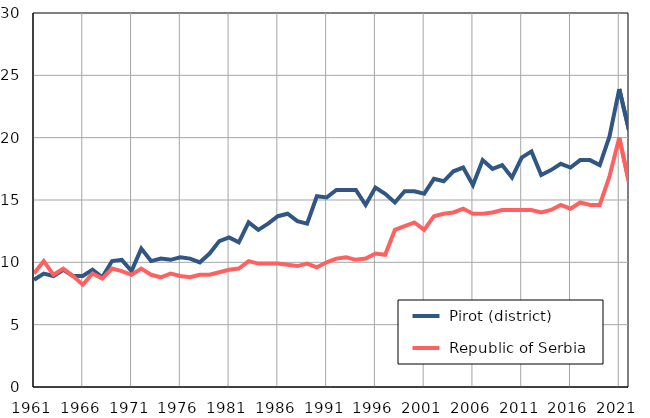
| Category |  Pirot (district) |  Republic of Serbia |
|---|---|---|
| 1961.0 | 8.6 | 9.1 |
| 1962.0 | 9.1 | 10.1 |
| 1963.0 | 8.9 | 9 |
| 1964.0 | 9.4 | 9.5 |
| 1965.0 | 8.9 | 8.9 |
| 1966.0 | 8.9 | 8.2 |
| 1967.0 | 9.4 | 9.1 |
| 1968.0 | 8.8 | 8.7 |
| 1969.0 | 10.1 | 9.5 |
| 1970.0 | 10.2 | 9.3 |
| 1971.0 | 9.3 | 9 |
| 1972.0 | 11.1 | 9.5 |
| 1973.0 | 10.1 | 9 |
| 1974.0 | 10.3 | 8.8 |
| 1975.0 | 10.2 | 9.1 |
| 1976.0 | 10.4 | 8.9 |
| 1977.0 | 10.3 | 8.8 |
| 1978.0 | 10 | 9 |
| 1979.0 | 10.7 | 9 |
| 1980.0 | 11.7 | 9.2 |
| 1981.0 | 12 | 9.4 |
| 1982.0 | 11.6 | 9.5 |
| 1983.0 | 13.2 | 10.1 |
| 1984.0 | 12.6 | 9.9 |
| 1985.0 | 13.1 | 9.9 |
| 1986.0 | 13.7 | 9.9 |
| 1987.0 | 13.9 | 9.8 |
| 1988.0 | 13.3 | 9.7 |
| 1989.0 | 13.1 | 9.9 |
| 1990.0 | 15.3 | 9.6 |
| 1991.0 | 15.2 | 10 |
| 1992.0 | 15.8 | 10.3 |
| 1993.0 | 15.8 | 10.4 |
| 1994.0 | 15.8 | 10.2 |
| 1995.0 | 14.6 | 10.3 |
| 1996.0 | 16 | 10.7 |
| 1997.0 | 15.5 | 10.6 |
| 1998.0 | 14.8 | 12.6 |
| 1999.0 | 15.7 | 12.9 |
| 2000.0 | 15.7 | 13.2 |
| 2001.0 | 15.5 | 12.6 |
| 2002.0 | 16.7 | 13.7 |
| 2003.0 | 16.5 | 13.9 |
| 2004.0 | 17.3 | 14 |
| 2005.0 | 17.6 | 14.3 |
| 2006.0 | 16.2 | 13.9 |
| 2007.0 | 18.2 | 13.9 |
| 2008.0 | 17.5 | 14 |
| 2009.0 | 17.8 | 14.2 |
| 2010.0 | 16.8 | 14.2 |
| 2011.0 | 18.4 | 14.2 |
| 2012.0 | 18.9 | 14.2 |
| 2013.0 | 17 | 14 |
| 2014.0 | 17.4 | 14.2 |
| 2015.0 | 17.9 | 14.6 |
| 2016.0 | 17.6 | 14.3 |
| 2017.0 | 18.2 | 14.8 |
| 2018.0 | 18.2 | 14.6 |
| 2019.0 | 17.8 | 14.6 |
| 2020.0 | 20.1 | 16.9 |
| 2021.0 | 23.9 | 20 |
| 2022.0 | 20.6 | 16.4 |